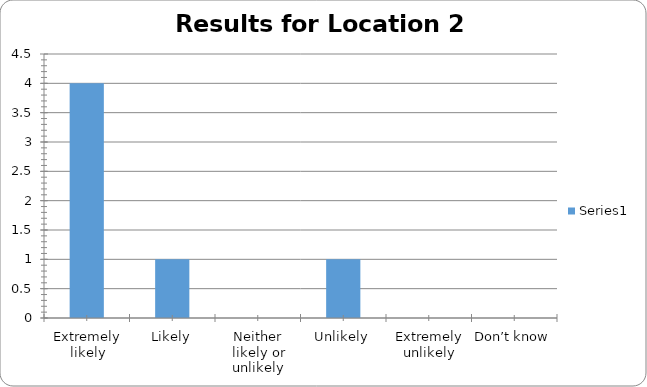
| Category | Series 0 |
|---|---|
| Extremely likely | 4 |
| Likely | 1 |
| Neither likely or unlikely | 0 |
| Unlikely | 1 |
| Extremely unlikely | 0 |
| Don’t know | 0 |